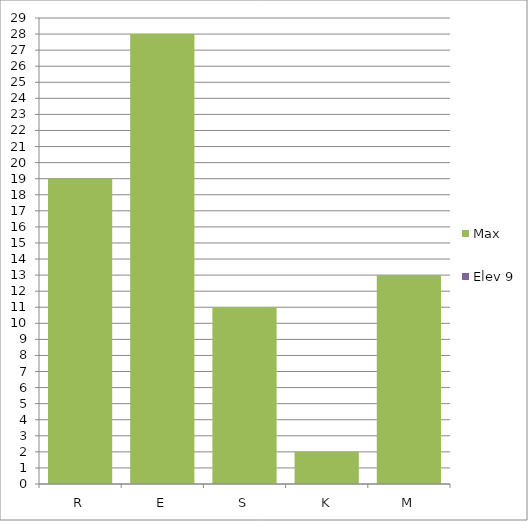
| Category | Max | Elev 9 |
|---|---|---|
| R | 19 | 0 |
| E | 28 | 0 |
| S | 11 | 0 |
| K | 2 | 0 |
| M | 13 | 0 |